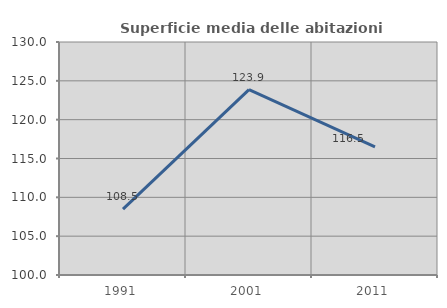
| Category | Superficie media delle abitazioni occupate |
|---|---|
| 1991.0 | 108.477 |
| 2001.0 | 123.857 |
| 2011.0 | 116.494 |